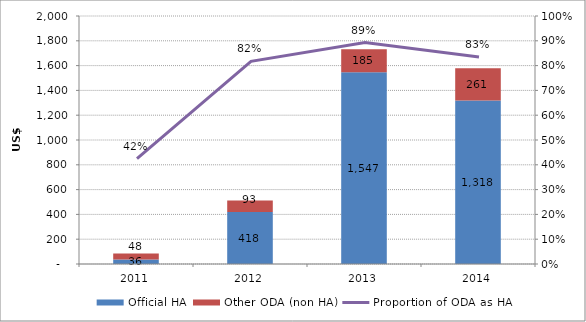
| Category | Official HA | Other ODA (non HA) |
|---|---|---|
| 2011 | 35.53 | 48.16 |
| 2012 | 418.38 | 93.49 |
| 2013 | 1547.02 | 185.39 |
| 2014 | 1317.83 | 260.67 |